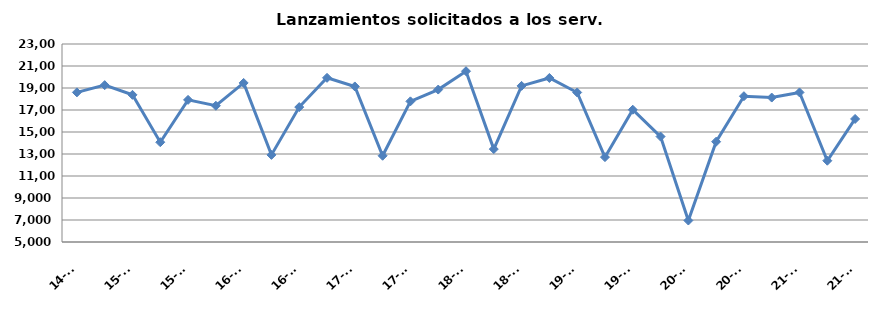
| Category | Lanzamientos solicitados a los Serv. comunes |
|---|---|
| 14-T4 | 18603 |
| 15-T1 | 19261 |
| 15-T2 | 18378 |
| 15-T3 | 14071 |
| 15-T4 | 17921 |
| 16-T1 | 17386 |
| 16-T2 | 19461 |
| 16-T3 | 12918 |
| 16-T4 | 17265 |
| 17-T1 | 19926 |
| 17-T2 | 19141 |
| 17-T3 | 12840 |
| 17-T4 | 17786 |
| 18-T1 | 18859 |
| 18-T2 | 20526 |
| 18-T3 | 13446 |
| 18-T4 | 19192 |
| 19-T1 | 19913 |
| 19-T2 | 18594 |
| 19-T3 | 12715 |
| 19-T4 | 17025 |
| 20-T1 | 14586 |
| 20-T2 | 6953 |
| 20-T3 | 14117 |
| 20-T4 | 18255 |
| 21-T1 | 18131 |
| 21-T2 | 18598 |
| 21-T3 | 12390 |
| 21-T4 | 16187 |